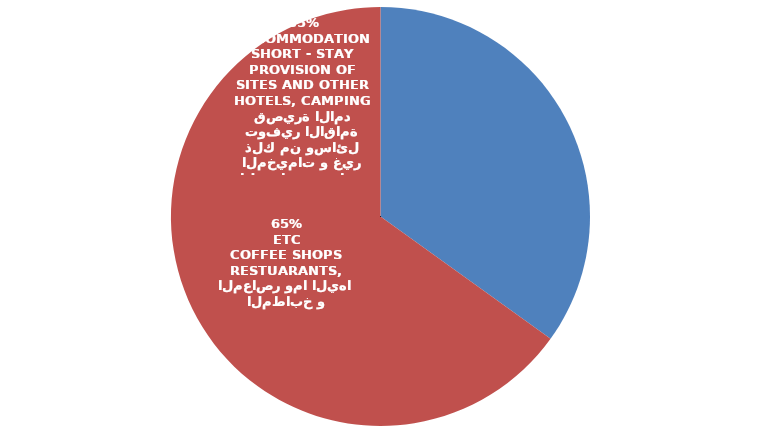
| Category | Series 0 |
|---|---|
| الفنادق و مواقع المخيمات و غير ذلك من وسائل توفير الاقامة قصيرة الامد
HOTELS, CAMPING SITES AND OTHER PROVISION OF SHORT - STAY ACCOMMODATION | 22079 |
| المطاعم و المعاصر و المقاهي و المطابخ و المعاصر وما اليها
RESTUARANTS, COFFEE SHOPS ETC | 41138 |